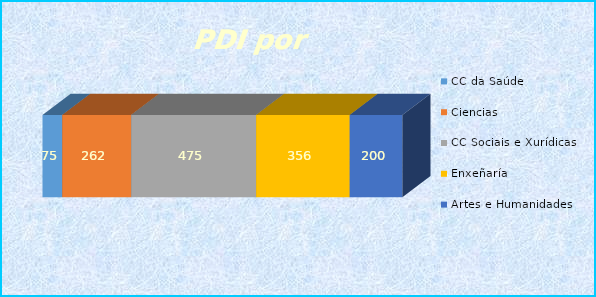
| Category | CC da Saúde | Ciencias | CC Sociais e Xurídicas | Enxeñaría | Artes e Humanidades |
|---|---|---|---|---|---|
| 0 | 75 | 262 | 475 | 356 | 200 |